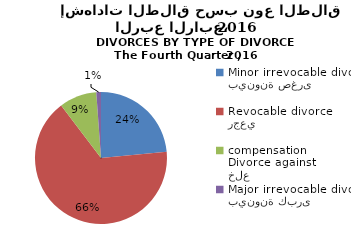
| Category | Series 1 |
|---|---|
| بينونة صغرى
Minor irrevocable divorce  | 82 |
| رجعي
Revocable divorce  | 231 |
| خلع
Divorce against compensation | 32 |
| بينونة كبرى
Major irrevocable divorce  | 4 |